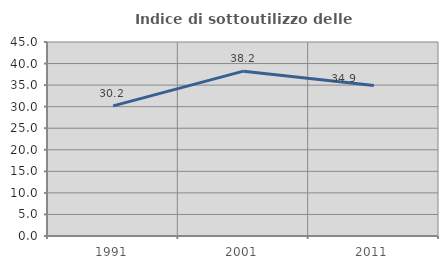
| Category | Indice di sottoutilizzo delle abitazioni  |
|---|---|
| 1991.0 | 30.18 |
| 2001.0 | 38.235 |
| 2011.0 | 34.898 |